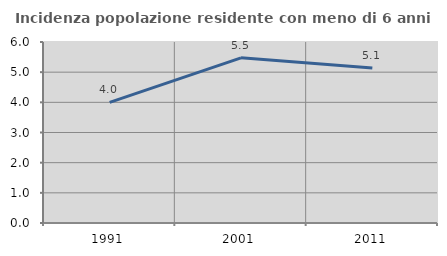
| Category | Incidenza popolazione residente con meno di 6 anni |
|---|---|
| 1991.0 | 3.997 |
| 2001.0 | 5.476 |
| 2011.0 | 5.135 |